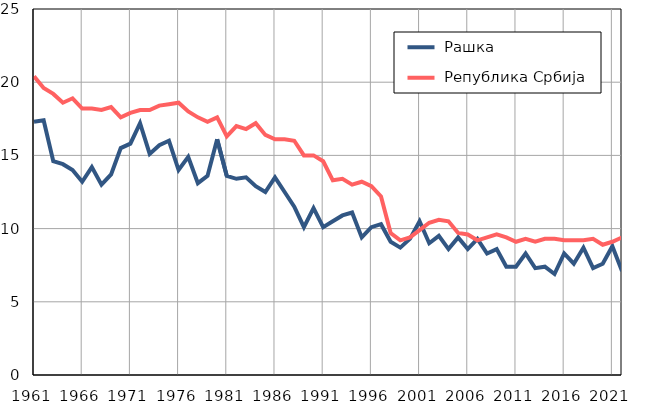
| Category |  Рашка |  Република Србија |
|---|---|---|
| 1961.0 | 17.3 | 20.4 |
| 1962.0 | 17.4 | 19.6 |
| 1963.0 | 14.6 | 19.2 |
| 1964.0 | 14.4 | 18.6 |
| 1965.0 | 14 | 18.9 |
| 1966.0 | 13.2 | 18.2 |
| 1967.0 | 14.2 | 18.2 |
| 1968.0 | 13 | 18.1 |
| 1969.0 | 13.7 | 18.3 |
| 1970.0 | 15.5 | 17.6 |
| 1971.0 | 15.8 | 17.9 |
| 1972.0 | 17.2 | 18.1 |
| 1973.0 | 15.1 | 18.1 |
| 1974.0 | 15.7 | 18.4 |
| 1975.0 | 16 | 18.5 |
| 1976.0 | 14 | 18.6 |
| 1977.0 | 14.9 | 18 |
| 1978.0 | 13.1 | 17.6 |
| 1979.0 | 13.6 | 17.3 |
| 1980.0 | 16.1 | 17.6 |
| 1981.0 | 13.6 | 16.3 |
| 1982.0 | 13.4 | 17 |
| 1983.0 | 13.5 | 16.8 |
| 1984.0 | 12.9 | 17.2 |
| 1985.0 | 12.5 | 16.4 |
| 1986.0 | 13.5 | 16.1 |
| 1987.0 | 12.5 | 16.1 |
| 1988.0 | 11.5 | 16 |
| 1989.0 | 10.1 | 15 |
| 1990.0 | 11.4 | 15 |
| 1991.0 | 10.1 | 14.6 |
| 1992.0 | 10.5 | 13.3 |
| 1993.0 | 10.9 | 13.4 |
| 1994.0 | 11.1 | 13 |
| 1995.0 | 9.4 | 13.2 |
| 1996.0 | 10.1 | 12.9 |
| 1997.0 | 10.3 | 12.2 |
| 1998.0 | 9.1 | 9.7 |
| 1999.0 | 8.7 | 9.2 |
| 2000.0 | 9.3 | 9.4 |
| 2001.0 | 10.5 | 9.9 |
| 2002.0 | 9 | 10.4 |
| 2003.0 | 9.5 | 10.6 |
| 2004.0 | 8.6 | 10.5 |
| 2005.0 | 9.4 | 9.7 |
| 2006.0 | 8.6 | 9.6 |
| 2007.0 | 9.3 | 9.2 |
| 2008.0 | 8.3 | 9.4 |
| 2009.0 | 8.6 | 9.6 |
| 2010.0 | 7.4 | 9.4 |
| 2011.0 | 7.4 | 9.1 |
| 2012.0 | 8.3 | 9.3 |
| 2013.0 | 7.3 | 9.1 |
| 2014.0 | 7.4 | 9.3 |
| 2015.0 | 6.9 | 9.3 |
| 2016.0 | 8.3 | 9.2 |
| 2017.0 | 7.6 | 9.2 |
| 2018.0 | 8.7 | 9.2 |
| 2019.0 | 7.3 | 9.3 |
| 2020.0 | 7.6 | 8.9 |
| 2021.0 | 8.8 | 9.1 |
| 2022.0 | 7.1 | 9.4 |